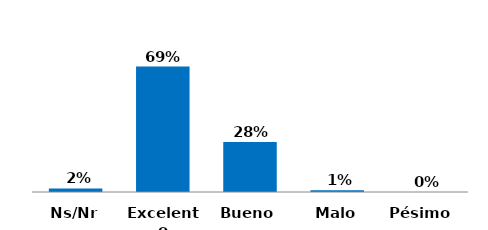
| Category | Series 0 |
|---|---|
| Pésimo  | 0 |
| Malo | 0.01 |
| Bueno | 0.277 |
| Excelente | 0.693 |
| Ns/Nr | 0.02 |